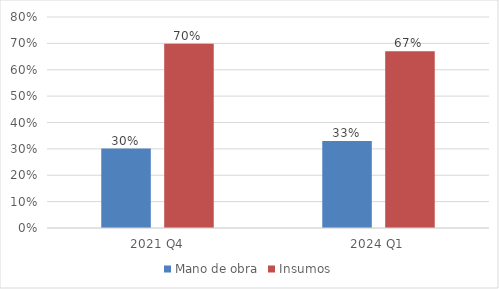
| Category | Mano de obra | Insumos |
|---|---|---|
| 2021 Q4 | 0.301 | 0.699 |
| 2024 Q1 | 0.33 | 0.67 |